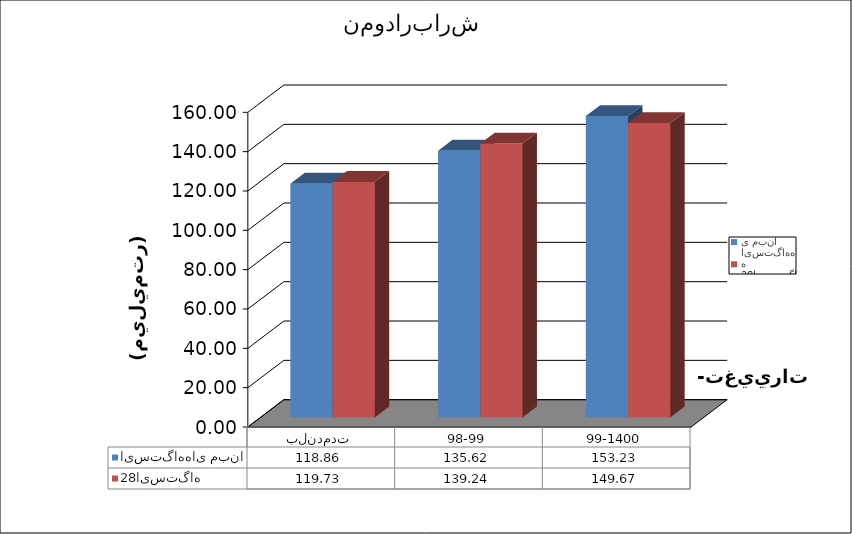
| Category | ایستگاههای مبنا |  28ایستگاه |
|---|---|---|
| بلندمدت | 118.861 | 119.726 |
| 98-99 | 135.619 | 139.237 |
| 99-1400 | 153.229 | 149.67 |